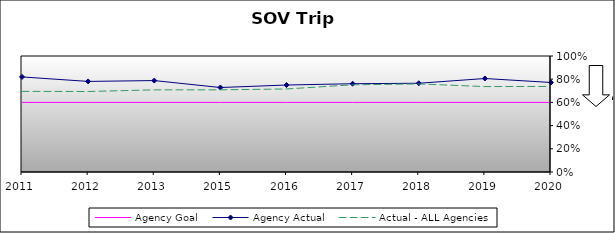
| Category | Agency Goal | Agency Actual | Actual - ALL Agencies |
|---|---|---|---|
| 2011.0 | 0.6 | 0.82 | 0.695 |
| 2012.0 | 0.6 | 0.781 | 0.694 |
| 2013.0 | 0.6 | 0.788 | 0.708 |
| 2015.0 | 0.6 | 0.728 | 0.708 |
| 2016.0 | 0.6 | 0.75 | 0.716 |
| 2017.0 | 0.6 | 0.761 | 0.752 |
| 2018.0 | 0.6 | 0.765 | 0.759 |
| 2019.0 | 0.6 | 0.806 | 0.736 |
| 2020.0 | 0.6 | 0.772 | 0.737 |